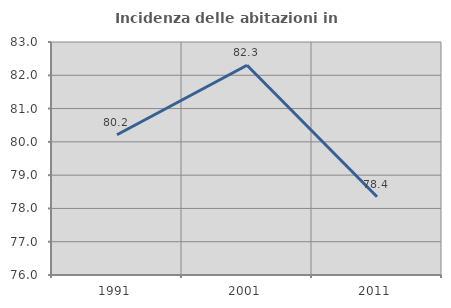
| Category | Incidenza delle abitazioni in proprietà  |
|---|---|
| 1991.0 | 80.212 |
| 2001.0 | 82.301 |
| 2011.0 | 78.351 |